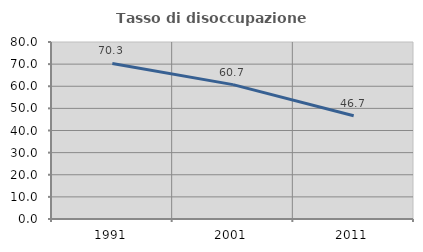
| Category | Tasso di disoccupazione giovanile  |
|---|---|
| 1991.0 | 70.323 |
| 2001.0 | 60.725 |
| 2011.0 | 46.667 |